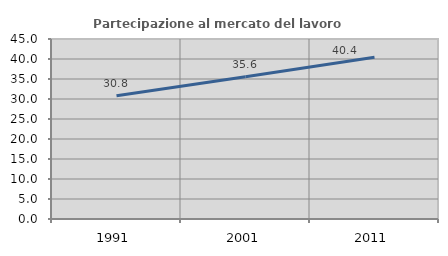
| Category | Partecipazione al mercato del lavoro  femminile |
|---|---|
| 1991.0 | 30.822 |
| 2001.0 | 35.578 |
| 2011.0 | 40.432 |